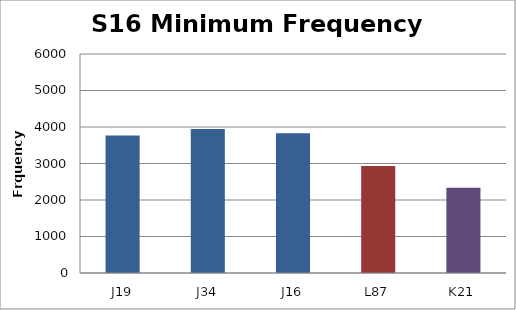
| Category | S16 Min Frequency (Hz) |
|---|---|
| J19 | 3764.71 |
| J34 | 3948.05 |
| J16 | 3831.32 |
| L87 | 2928.1 |
| K21 | 2337.66 |